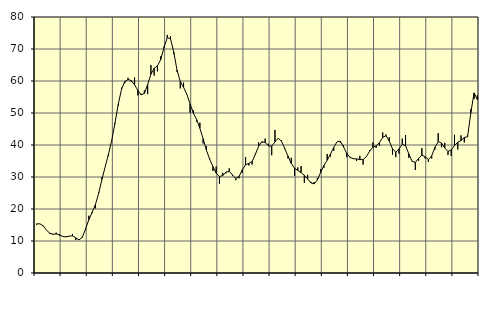
| Category | Piggar | Series 1 |
|---|---|---|
| nan | 15.1 | 15.37 |
| 87.0 | 15.3 | 15.35 |
| 87.0 | 14.6 | 14.76 |
| 87.0 | 13.5 | 13.49 |
| nan | 12.2 | 12.41 |
| 88.0 | 12 | 12.11 |
| 88.0 | 12.6 | 12.19 |
| 88.0 | 11.6 | 11.96 |
| nan | 11.3 | 11.42 |
| 89.0 | 11.4 | 11.27 |
| 89.0 | 11.5 | 11.56 |
| 89.0 | 12.2 | 11.59 |
| nan | 10.3 | 11 |
| 90.0 | 10.6 | 10.37 |
| 90.0 | 11.4 | 11.17 |
| 90.0 | 13.4 | 13.77 |
| nan | 17.9 | 16.67 |
| 91.0 | 18.7 | 18.98 |
| 91.0 | 20.2 | 21.38 |
| 91.0 | 25.2 | 24.92 |
| nan | 29.9 | 29.23 |
| 92.0 | 33.2 | 33.21 |
| 92.0 | 36.5 | 37.09 |
| 92.0 | 41.5 | 41.45 |
| nan | 46.6 | 46.85 |
| 93.0 | 52.3 | 52.72 |
| 93.0 | 57.9 | 57.41 |
| 93.0 | 59.3 | 59.82 |
| nan | 61 | 60.47 |
| 94.0 | 59.8 | 60.13 |
| 94.0 | 61.1 | 58.81 |
| 94.0 | 55.5 | 57.07 |
| nan | 56 | 55.67 |
| 95.0 | 57 | 56.12 |
| 95.0 | 55.9 | 58.87 |
| 95.0 | 65 | 62.09 |
| nan | 61.7 | 63.99 |
| 96.0 | 63 | 64.73 |
| 96.0 | 67.7 | 66.66 |
| 96.0 | 70.8 | 70.43 |
| nan | 74.4 | 73.5 |
| 97.0 | 74 | 73.25 |
| 97.0 | 68.4 | 69.02 |
| 97.0 | 62.9 | 63.42 |
| nan | 57.7 | 59.87 |
| 98.0 | 59.5 | 58.04 |
| 98.0 | 55.9 | 55.9 |
| 98.0 | 50.1 | 52.84 |
| nan | 50.8 | 50 |
| 99.0 | 47.3 | 47.96 |
| 99.0 | 47 | 45.23 |
| 99.0 | 40.5 | 41.94 |
| nan | 39.6 | 38.42 |
| 0.0 | 35.9 | 35.58 |
| 0.0 | 31.9 | 33.25 |
| 0.0 | 33.3 | 31.18 |
| nan | 27.9 | 30.14 |
| 1.0 | 31.3 | 30.45 |
| 1.0 | 31.2 | 31.55 |
| 1.0 | 32.7 | 31.75 |
| nan | 30.3 | 30.64 |
| 2.0 | 29 | 29.56 |
| 2.0 | 29.6 | 30.17 |
| 2.0 | 31.3 | 32.25 |
| nan | 36.2 | 33.83 |
| 3.0 | 33.6 | 34.23 |
| 3.0 | 33.9 | 34.86 |
| 3.0 | 37.3 | 37.07 |
| nan | 40.8 | 39.63 |
| 4.0 | 40.7 | 41.02 |
| 4.0 | 42 | 40.77 |
| 4.0 | 40.4 | 39.73 |
| nan | 36.8 | 39.63 |
| 5.0 | 44.7 | 40.96 |
| 5.0 | 42.1 | 42.11 |
| 5.0 | 41.4 | 41.17 |
| nan | 38.7 | 38.91 |
| 6.0 | 35.8 | 36.51 |
| 6.0 | 36 | 34.23 |
| 6.0 | 30.4 | 32.78 |
| nan | 33 | 32.07 |
| 7.0 | 33.4 | 31.38 |
| 7.0 | 28.2 | 30.53 |
| 7.0 | 30.7 | 29.38 |
| nan | 28.5 | 28.18 |
| 8.0 | 28.4 | 27.85 |
| 8.0 | 29.7 | 29.06 |
| 8.0 | 32.5 | 31.49 |
| nan | 32.9 | 33.6 |
| 9.0 | 37.2 | 35.23 |
| 9.0 | 36.4 | 37.13 |
| 9.0 | 38.2 | 39.25 |
| nan | 41 | 41 |
| 10.0 | 40.8 | 41.22 |
| 10.0 | 39.9 | 39.43 |
| 10.0 | 36.2 | 37.36 |
| nan | 36.3 | 36.11 |
| 11.0 | 35.8 | 35.71 |
| 11.0 | 35 | 35.66 |
| 11.0 | 36.6 | 35.43 |
| nan | 33.9 | 35.45 |
| 12.0 | 36.4 | 36.35 |
| 12.0 | 38.3 | 38.05 |
| 12.0 | 40.8 | 39.31 |
| nan | 39.1 | 39.72 |
| 13.0 | 39.7 | 40.7 |
| 13.0 | 43.9 | 42.39 |
| 13.0 | 43.3 | 42.89 |
| nan | 42.4 | 41.26 |
| 14.0 | 37 | 38.83 |
| 14.0 | 36.2 | 37.74 |
| 14.0 | 37.3 | 38.77 |
| nan | 42 | 40.2 |
| 15.0 | 43.1 | 39.78 |
| 15.0 | 36 | 37.25 |
| 15.0 | 34.8 | 34.89 |
| nan | 32.2 | 34.56 |
| 16.0 | 35.1 | 35.82 |
| 16.0 | 39 | 36.83 |
| 16.0 | 35.8 | 36.34 |
| nan | 34.7 | 35.45 |
| 17.0 | 35.8 | 36.57 |
| 17.0 | 38.6 | 39.3 |
| 17.0 | 43.7 | 41.02 |
| nan | 39.3 | 40.63 |
| 18.0 | 40.7 | 39.06 |
| 18.0 | 36.9 | 38.01 |
| 18.0 | 36.6 | 38.45 |
| nan | 43.2 | 39.84 |
| 19.0 | 38.6 | 40.9 |
| 19.0 | 43 | 41.38 |
| 19.0 | 40.8 | 42.35 |
| nan | 43 | 42.56 |
| 20.0 | 51.2 | 50.1 |
| 20.0 | 54.4 | 56.29 |
| 20.0 | 55.5 | 54.17 |